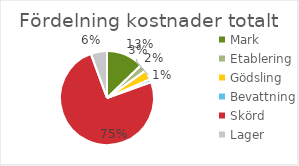
| Category | KOSTNADER - TOTALT kr |
|---|---|
| Mark | 150000 |
| Etablering | 27560 |
| Gödsling | 39312 |
| Bevattning | 12096 |
| Skörd | 878712 |
| Lager | 65500 |